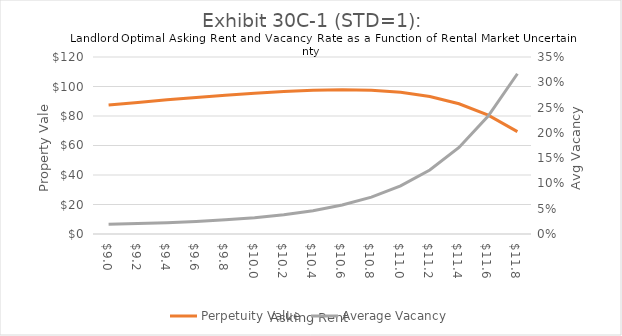
| Category | Perpetuity Value |
|---|---|
| 9.0 | 87.435 |
| 9.2 | 89.224 |
| 9.399999999999999 | 90.95 |
| 9.599999999999998 | 92.592 |
| 9.799999999999997 | 94.116 |
| 9.999999999999996 | 95.477 |
| 10.199999999999996 | 96.609 |
| 10.399999999999995 | 97.415 |
| 10.599999999999994 | 97.75 |
| 10.799999999999994 | 97.396 |
| 10.999999999999993 | 96.037 |
| 11.199999999999992 | 93.216 |
| 11.399999999999991 | 88.314 |
| 11.59999999999999 | 80.594 |
| 11.79999999999999 | 69.399 |